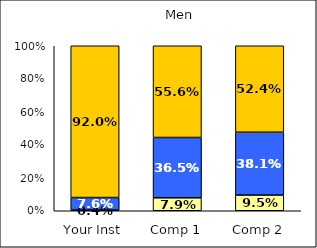
| Category | Low College Reputation Orientation | Average College Reputation Orientation | High College Reputation Orientation |
|---|---|---|---|
| Your Inst | 0.004 | 0.076 | 0.92 |
| Comp 1 | 0.079 | 0.365 | 0.556 |
| Comp 2 | 0.095 | 0.381 | 0.524 |